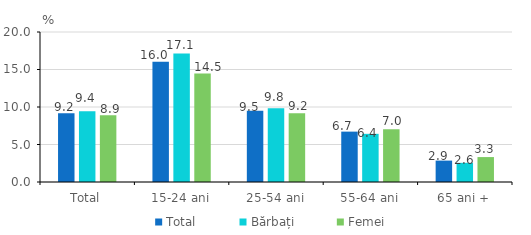
| Category | Total | Bărbați | Femei |
|---|---|---|---|
| Total | 9.171 | 9.442 | 8.896 |
| 15-24 ani | 16.049 | 17.128 | 14.451 |
| 25-54 ani | 9.487 | 9.84 | 9.153 |
| 55-64 ani | 6.717 | 6.422 | 7.037 |
| 65 ani + | 2.853 | 2.556 | 3.324 |